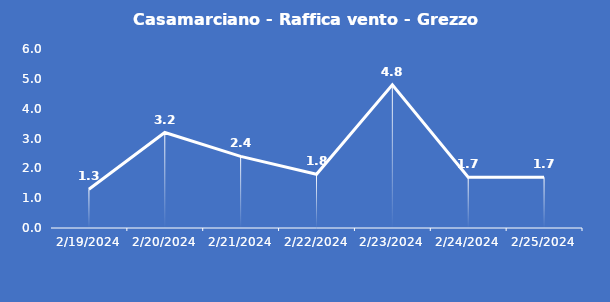
| Category | Casamarciano - Raffica vento - Grezzo (m/s) |
|---|---|
| 2/19/24 | 1.3 |
| 2/20/24 | 3.2 |
| 2/21/24 | 2.4 |
| 2/22/24 | 1.8 |
| 2/23/24 | 4.8 |
| 2/24/24 | 1.7 |
| 2/25/24 | 1.7 |